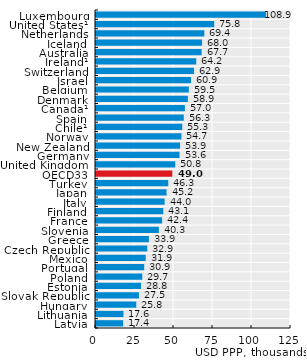
| Category | Series 0 |
|---|---|
| Latvia | 17.397 |
| Lithuania | 17.627 |
| Hungary | 25.803 |
| Slovak Republic | 27.514 |
| Estonia | 28.839 |
| Poland | 29.661 |
| Portugal | 30.888 |
| Mexico | 31.894 |
| Czech Republic | 32.879 |
| Greece | 33.92 |
| Slovenia | 40.288 |
| France | 42.367 |
| Finland | 43.116 |
| Italy | 43.992 |
| Japan | 45.236 |
| Turkey | 46.32 |
| OECD33 | 48.954 |
| United Kingdom | 50.803 |
| Germany | 53.551 |
| New Zealand | 53.89 |
| Norway | 54.743 |
| Chile¹ | 55.272 |
| Spain | 56.263 |
| Canada¹ | 56.979 |
| Denmark | 58.891 |
| Belgium | 59.503 |
| Israel | 60.914 |
| Switzerland | 62.857 |
| Ireland¹ | 64.242 |
| Australia | 67.688 |
| Iceland | 67.985 |
| Netherlands | 69.445 |
| United States¹ | 75.77 |
| Luxembourg | 108.928 |